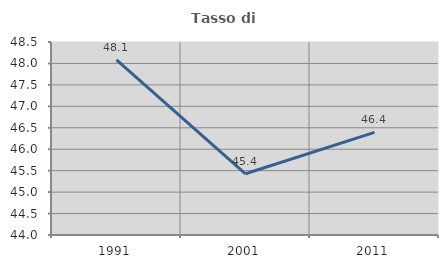
| Category | Tasso di occupazione   |
|---|---|
| 1991.0 | 48.083 |
| 2001.0 | 45.428 |
| 2011.0 | 46.394 |